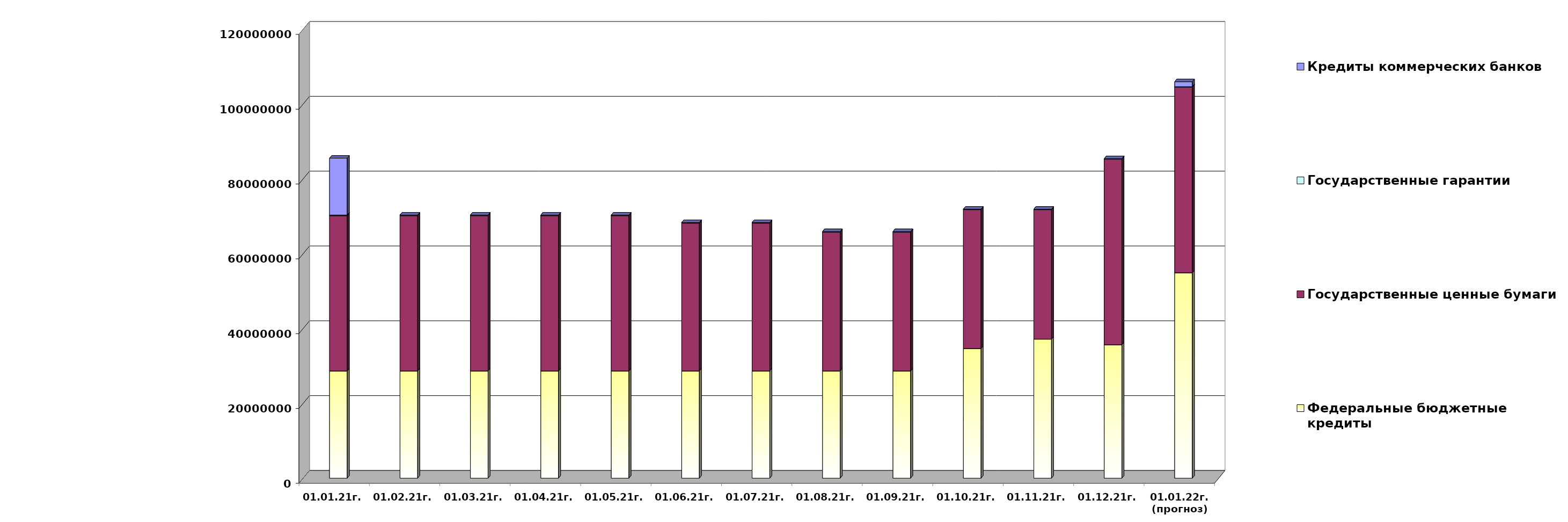
| Category | Федеральные бюджетные кредиты | Государственные ценные бумаги  | Государственные гарантии | Кредиты коммерческих банков |
|---|---|---|---|---|
| 01.01.21г. | 28654967.463 | 41500000 | 184738.25 | 15190000 |
| 01.02.21г. | 28654967.463 | 41500000 | 182966.25 | 0 |
| 01.03.21г. | 28654967.463 | 41500000 | 182966.25 | 0 |
| 01.04.21г. | 28654967.463 | 41500000 | 182966.25 | 0 |
| 01.05.21г. | 28654967.463 | 41500000 | 174735.46 | 0 |
| 01.06.21г. | 28654967.463 | 39500000 | 174735.46 | 0 |
| 01.07.21г. | 28654967.463 | 39500000 | 174735.46 | 0 |
| 01.08.21г. | 28654967.463 | 37100000 | 158212.22 | 0 |
| 01.09.21г. | 28654967.463 | 37100000 | 158212.22 | 0 |
| 01.10.21г. | 34649676.663 | 37100000 | 158212.22 | 0 |
| 01.11.21г. | 37149676.663 | 34600000 | 141570.67 | 0 |
| 01.12.21г. | 35662617.913 | 49600000 | 141570.67 | 0 |
| 01.01.22г.
(прогноз) | 54900618.7 | 49600000 | 141570.7 | 1329418.4 |